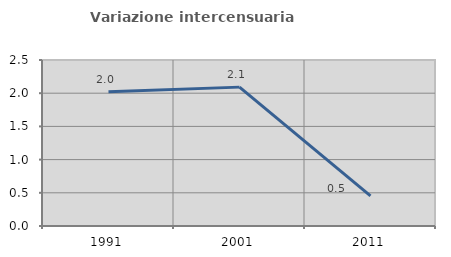
| Category | Variazione intercensuaria annua |
|---|---|
| 1991.0 | 2.02 |
| 2001.0 | 2.092 |
| 2011.0 | 0.455 |